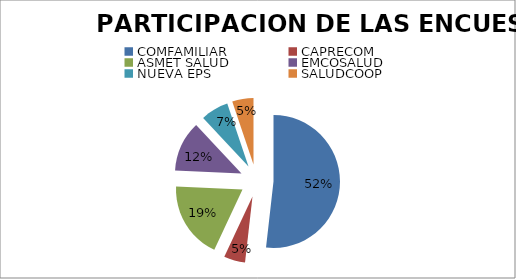
| Category | Series 0 | Series 1 |
|---|---|---|
| COMFAMILIAR | 130 | 0.518 |
| CAPRECOM | 13 | 0.052 |
| ASMET SALUD | 47 | 0.187 |
| EMCOSALUD | 31 | 0.124 |
| NUEVA EPS | 17 | 0.068 |
| SALUDCOOP | 13 | 0.052 |